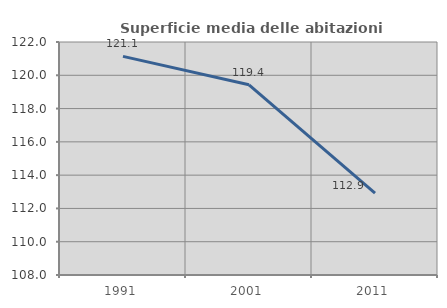
| Category | Superficie media delle abitazioni occupate |
|---|---|
| 1991.0 | 121.137 |
| 2001.0 | 119.427 |
| 2011.0 | 112.913 |